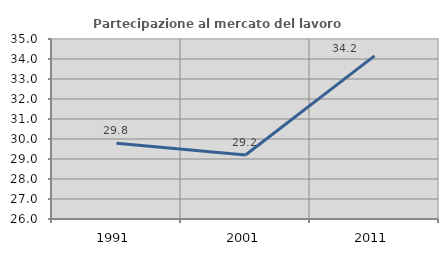
| Category | Partecipazione al mercato del lavoro  femminile |
|---|---|
| 1991.0 | 29.785 |
| 2001.0 | 29.197 |
| 2011.0 | 34.159 |